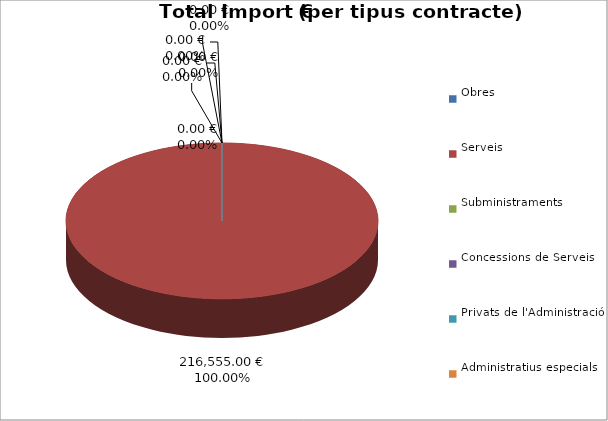
| Category | Total preu
(amb IVA) |
|---|---|
| Obres | 0 |
| Serveis | 216555 |
| Subministraments | 0 |
| Concessions de Serveis | 0 |
| Privats de l'Administració | 0 |
| Administratius especials | 0 |